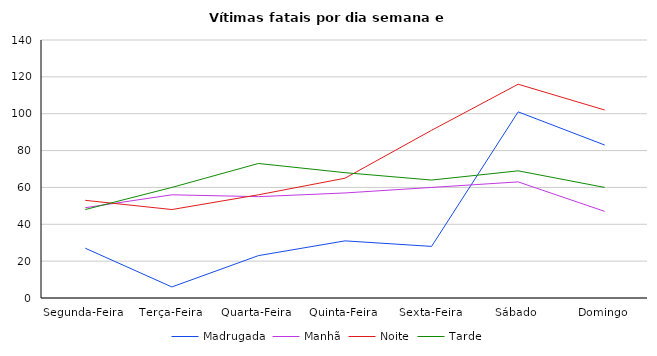
| Category | Madrugada | Manhã | Noite | Tarde |
|---|---|---|---|---|
| Segunda-Feira | 27 | 49 | 53 | 48 |
| Terça-Feira | 6 | 56 | 48 | 60 |
| Quarta-Feira | 23 | 55 | 56 | 73 |
| Quinta-Feira | 31 | 57 | 65 | 68 |
| Sexta-Feira | 28 | 60 | 91 | 64 |
| Sábado | 101 | 63 | 116 | 69 |
| Domingo | 83 | 47 | 102 | 60 |